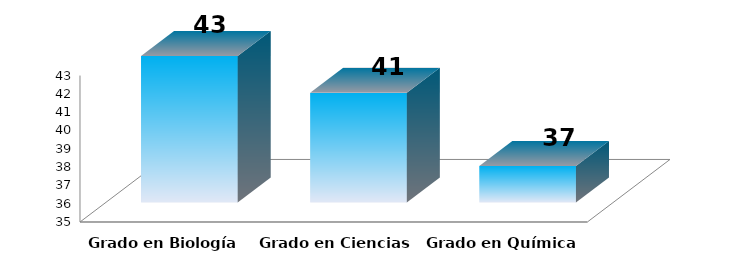
| Category | Series 0 |
|---|---|
| Grado en Biología | 43 |
| Grado en Ciencias Ambientales | 41 |
| Grado en Química | 37 |